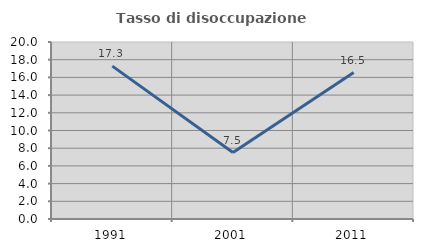
| Category | Tasso di disoccupazione giovanile  |
|---|---|
| 1991.0 | 17.273 |
| 2001.0 | 7.512 |
| 2011.0 | 16.547 |